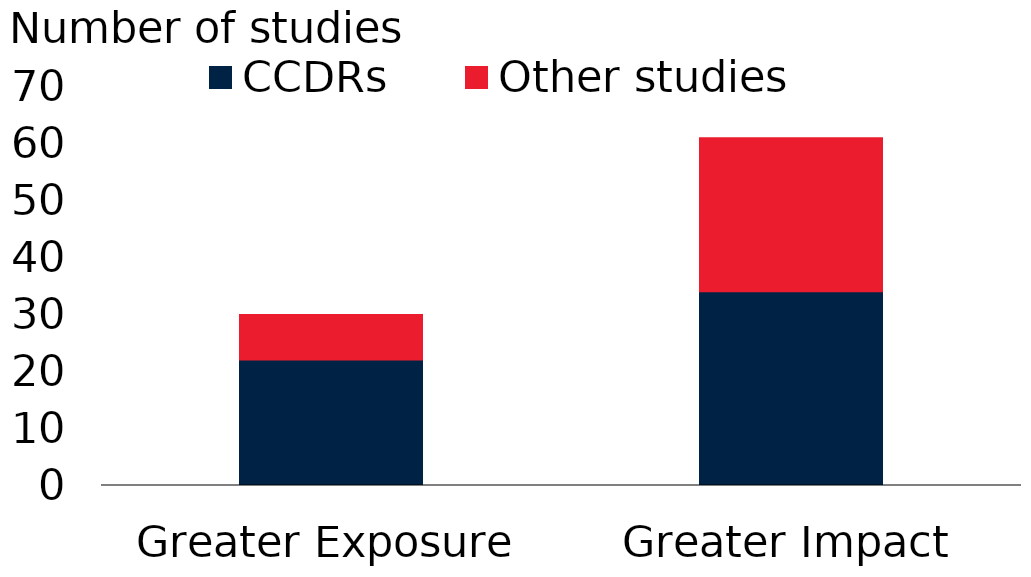
| Category | CCDRs | Other studies |
|---|---|---|
| Greater Exposure | 22 | 8 |
| Greater Impact | 34 | 27 |